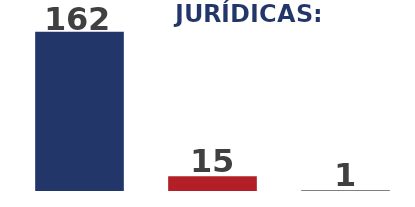
| Category | Series 0 |
|---|---|
| 0 | 162 |
| 1 | 15 |
| 2 | 1 |